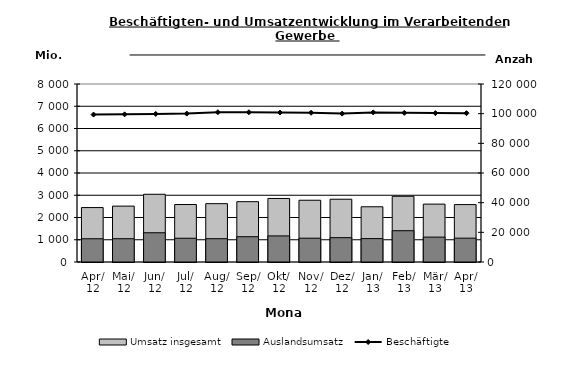
| Category | Umsatz insgesamt | Auslandsumsatz |
|---|---|---|
| 2012-04-01 | 2446.427 | 1044.941 |
| 2012-05-01 | 2511.664 | 1046.581 |
| 2012-06-01 | 3043.821 | 1314.446 |
| 2012-07-01 | 2583.605 | 1066.984 |
| 2012-08-01 | 2621.741 | 1047.425 |
| 2012-09-01 | 2712.074 | 1135.543 |
| 2012-10-01 | 2855.379 | 1172.066 |
| 2012-11-01 | 2775.413 | 1069.743 |
| 2012-12-01 | 2821.024 | 1093.843 |
| 2013-01-01 | 2482.358 | 1051.73 |
| 2013-02-01 | 2953.548 | 1406.322 |
| 2013-03-01 | 2601.416 | 1118.337 |
| 2013-04-01 | 2580.069 | 1071.396 |